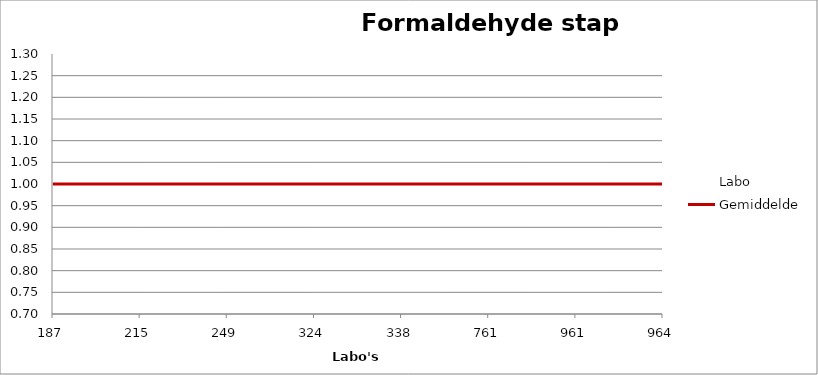
| Category | Labo | Gemiddelde |
|---|---|---|
| 187.0 | 0.999 | 1 |
| 215.0 | 1.06 | 1 |
| 249.0 | 0.898 | 1 |
| 324.0 | 1.083 | 1 |
| 338.0 | 4.351 | 1 |
| 761.0 | 1.023 | 1 |
| 961.0 | 0.73 | 1 |
| 964.0 | 1.039 | 1 |